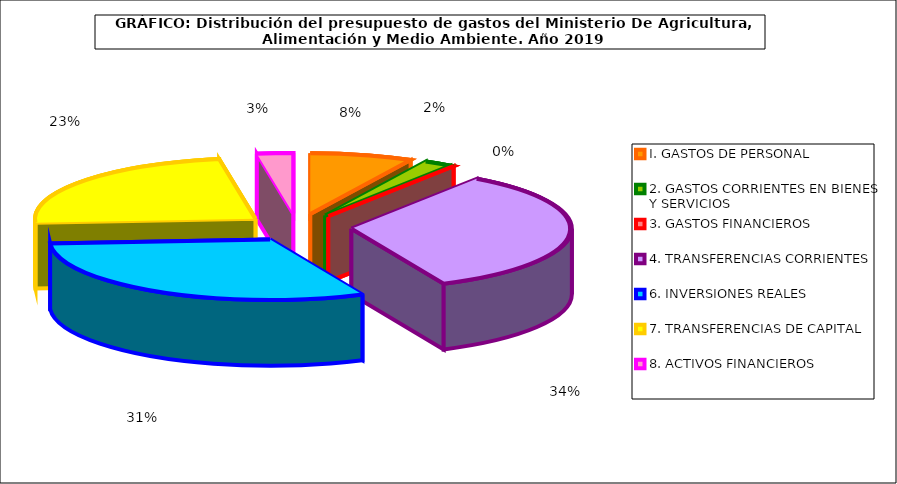
| Category | I. GASTOS DE PERSONAL |
|---|---|
| I. GASTOS DE PERSONAL | 68812060 |
| 2. GASTOS CORRIENTES EN BIENES Y SERVICIOS | 19092150 |
| 3. GASTOS FINANCIEROS | 94770 |
| 4. TRANSFERENCIAS CORRIENTES | 306659870 |
| 6. INVERSIONES REALES | 282205910 |
| 7. TRANSFERENCIAS DE CAPITAL | 214151370 |
| 8. ACTIVOS FINANCIEROS | 24137520 |